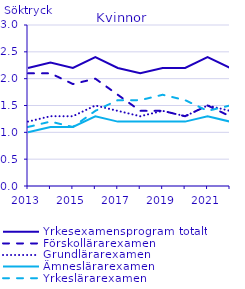
| Category | Yrkesexamensprogram totalt | Förskollärarexamen                                 | Grundlärarexamen                                   | Ämneslärarexamen                                   | Yrkeslärarexamen                                   |
|---|---|---|---|---|---|
| 2013.0 | 2.2 | 2.1 | 1.2 | 1 | 1.1 |
| 2014.0 | 2.3 | 2.1 | 1.3 | 1.1 | 1.2 |
| 2015.0 | 2.2 | 1.9 | 1.3 | 1.1 | 1.1 |
| 2016.0 | 2.4 | 2 | 1.5 | 1.3 | 1.4 |
| 2017.0 | 2.2 | 1.7 | 1.4 | 1.2 | 1.6 |
| 2018.0 | 2.1 | 1.4 | 1.3 | 1.2 | 1.6 |
| 2019.0 | 2.2 | 1.4 | 1.4 | 1.2 | 1.7 |
| 2020.0 | 2.2 | 1.3 | 1.3 | 1.2 | 1.6 |
| 2021.0 | 2.4 | 1.5 | 1.5 | 1.3 | 1.4 |
| 2022.0 | 2.2 | 1.3 | 1.4 | 1.2 | 1.5 |